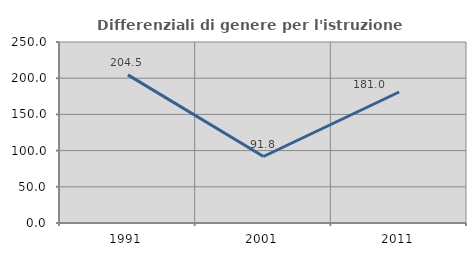
| Category | Differenziali di genere per l'istruzione superiore |
|---|---|
| 1991.0 | 204.545 |
| 2001.0 | 91.837 |
| 2011.0 | 180.952 |